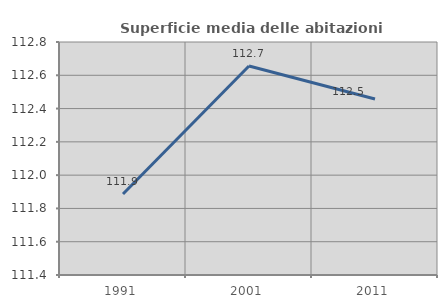
| Category | Superficie media delle abitazioni occupate |
|---|---|
| 1991.0 | 111.887 |
| 2001.0 | 112.655 |
| 2011.0 | 112.457 |